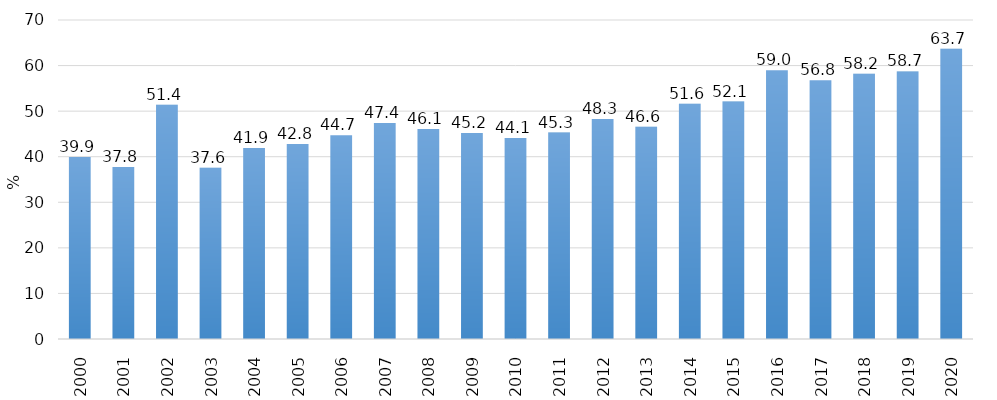
| Category | Series 0 |
|---|---|
| 2000.0 | 39.926 |
| 2001.0 | 37.758 |
| 2002.0 | 51.396 |
| 2003.0 | 37.569 |
| 2004.0 | 41.926 |
| 2005.0 | 42.8 |
| 2006.0 | 44.7 |
| 2007.0 | 47.4 |
| 2008.0 | 46.1 |
| 2009.0 | 45.2 |
| 2010.0 | 44.1 |
| 2011.0 | 45.3 |
| 2012.0 | 48.3 |
| 2013.0 | 46.6 |
| 2014.0 | 51.6 |
| 2015.0 | 52.1 |
| 2016.0 | 59 |
| 2017.0 | 56.8 |
| 2018.0 | 58.2 |
| 2019.0 | 58.7 |
| 2020.0 | 63.7 |